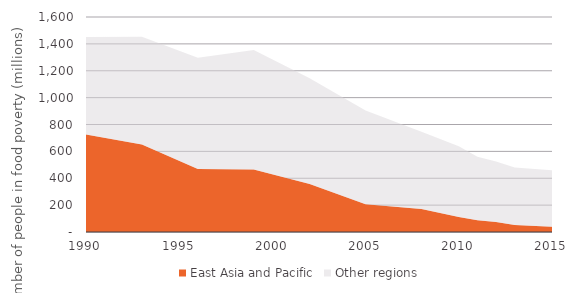
| Category | East Asia and Pacific | Other regions |
|---|---|---|
| 1990.0 | 725.411 | 725.244 |
| 1993.0 | 650.852 | 802.77 |
| 1996.0 | 469.082 | 826.898 |
| 1999.0 | 465.893 | 888.211 |
| 2002.0 | 357.763 | 787.004 |
| 2005.0 | 206.933 | 696.588 |
| 2008.0 | 170.502 | 576.011 |
| 2010.0 | 111.628 | 527.095 |
| 2011.0 | 87.954 | 472.698 |
| 2012.0 | 74.651 | 449.551 |
| 2013.0 | 52.274 | 427.78 |
| 2015.0 | 39.53 | 420.269 |